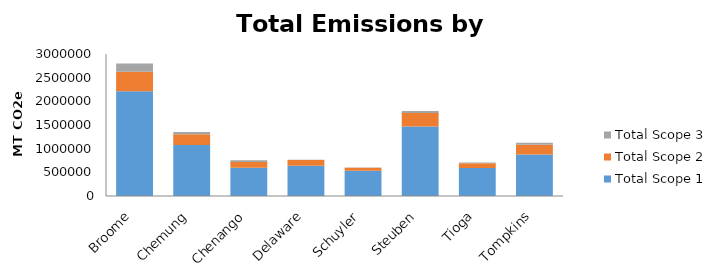
| Category | Total Scope 1 | Total Scope 2 | Total Scope 3 |
|---|---|---|---|
| Broome | 2213865.694 | 413119.253 | 173595.629 |
| Chemung | 1075878.065 | 229614.791 | 44149.762 |
| Chenango | 598706.932 | 121263.037 | 37648.289 |
| Delaware | 641110.958 | 121380.246 | 5941.24 |
| Schuyler | 534338.39 | 63811.463 | 4469.617 |
| Steuben | 1469605.846 | 286554.041 | 38168.539 |
| Tioga | 589275.603 | 103778.995 | 16027.153 |
| Tompkins | 875064.966 | 207226.414 | 43556.147 |